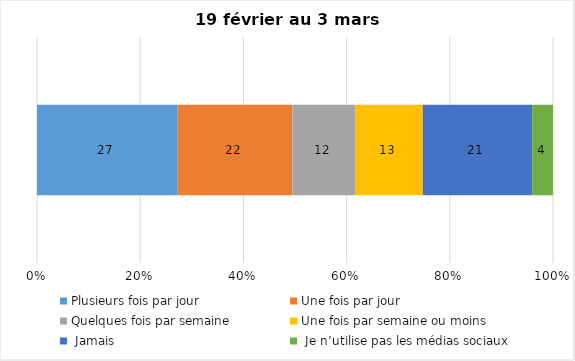
| Category | Plusieurs fois par jour | Une fois par jour | Quelques fois par semaine   | Une fois par semaine ou moins   |  Jamais   |  Je n’utilise pas les médias sociaux |
|---|---|---|---|---|---|---|
| 0 | 27 | 22 | 12 | 13 | 21 | 4 |